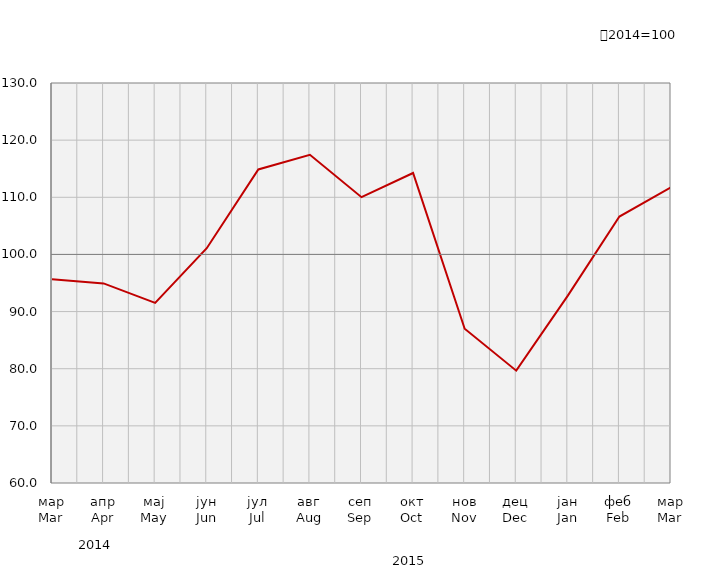
| Category | Индекси ноћења туриста
Tourist night indices |
|---|---|
| мар
Mar | 95.676 |
| апр
Apr | 94.927 |
| мај
May | 91.529 |
| јун
Jun | 101.092 |
| јул
Jul | 114.875 |
| авг
Aug | 117.438 |
| сеп
Sep | 110.023 |
| окт
Oct | 114.25 |
| нов
Nov | 86.993 |
| дец
Dec | 79.66 |
| јан
Jan | 92.8 |
| феб
Feb | 106.635 |
| мар
Mar | 111.734 |